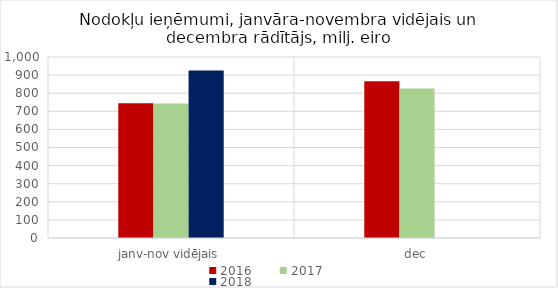
| Category | 2016 | 2017 | 2018 |
|---|---|---|---|
| janv-nov vidējais | 744687.411 | 743640.949 | 925567.815 |
| dec | 865773.712 | 826496.37 | 0 |